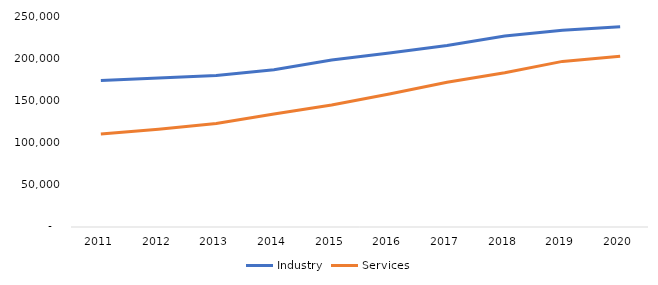
| Category | Industry | Services |
|---|---|---|
| 2011.0 | 173564 | 110280 |
| 2012.0 | 176433 | 115874 |
| 2013.0 | 179584 | 122755 |
| 2014.0 | 186335 | 133818 |
| 2015.0 | 197914 | 144581 |
| 2016.0 | 206060 | 157672 |
| 2017.0 | 215122 | 171579 |
| 2018.0 | 226294 | 182694 |
| 2019.0 | 233076 | 196223 |
| 2020.0 | 237122 | 202260 |